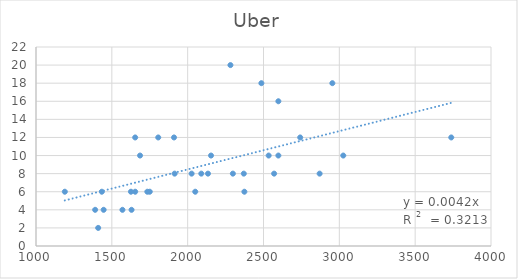
| Category | Uber |
|---|---|
| 2870.0 | 8 |
| 1570.0 | 4 |
| 2374.0 | 6 |
| 2026.0 | 8 |
| 1410.0 | 2 |
| 2598.0 | 10 |
| 2370.0 | 8 |
| 1910.0 | 12 |
| 3738.0 | 12 |
| 2570.0 | 8 |
| 1654.0 | 12 |
| 1630.0 | 4 |
| 1626.0 | 6 |
| 1390.0 | 4 |
| 2298.0 | 8 |
| 1190.0 | 6 |
| 2742.0 | 12 |
| 2486.0 | 18 |
| 1446.0 | 4 |
| 2534.0 | 10 |
| 2090.0 | 8 |
| 1806.0 | 12 |
| 1654.0 | 6 |
| 2050.0 | 6 |
| 2134.0 | 8 |
| 1434.0 | 6 |
| 1914.0 | 8 |
| 1734.0 | 6 |
| 2282.0 | 20 |
| 2954.0 | 18 |
| 1686.0 | 10 |
| 2598.0 | 16 |
| 1750.0 | 6 |
| 3026.0 | 10 |
| 2154.0 | 10 |